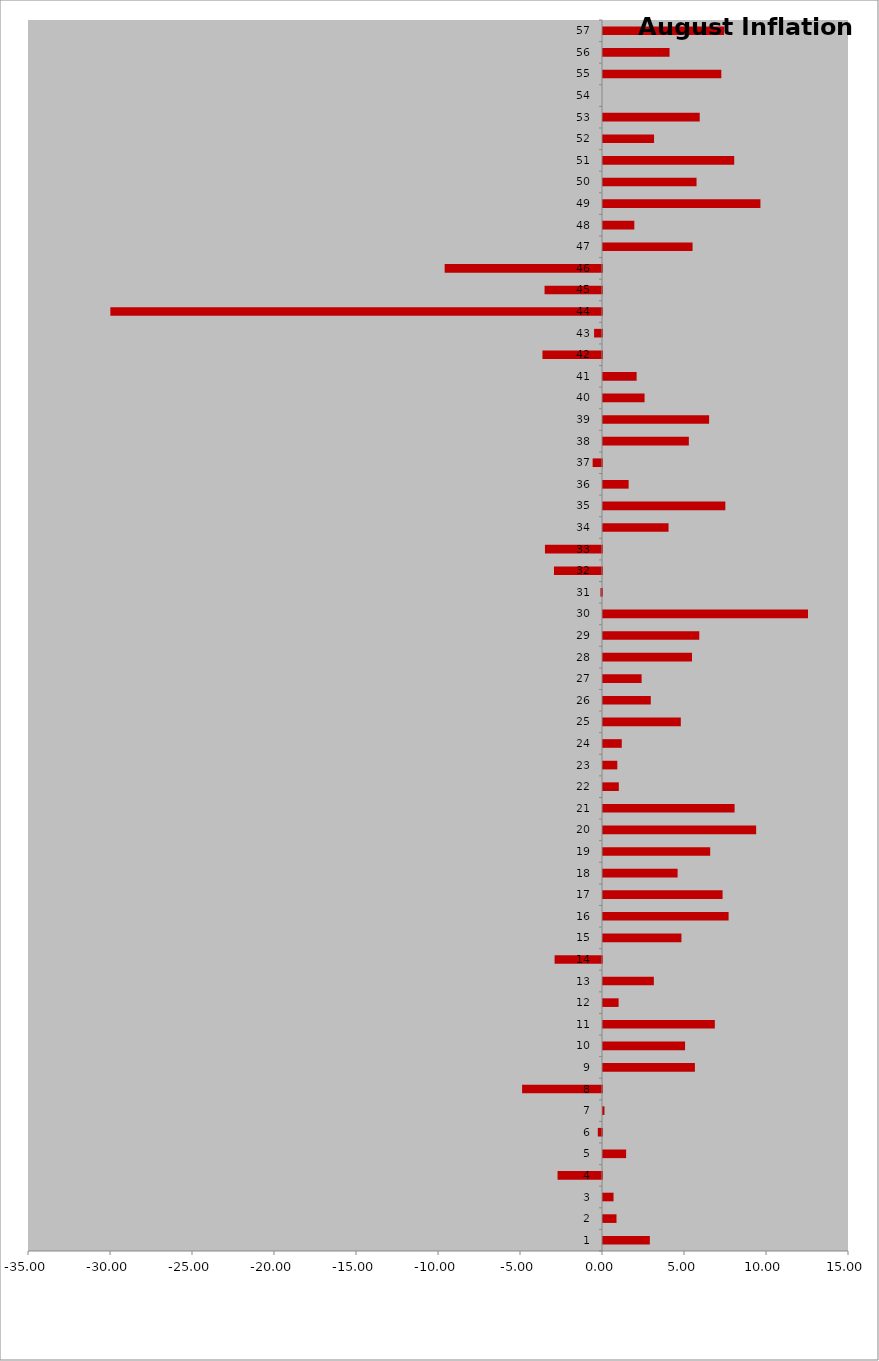
| Category | August Inflation Rate |
|---|---|
| 0 | 2.857 |
| 1 | 0.823 |
| 2 | 0.643 |
| 3 | -2.71 |
| 4 | 1.41 |
| 5 | -0.256 |
| 6 | 0.089 |
| 7 | -4.873 |
| 8 | 5.604 |
| 9 | 5.004 |
| 10 | 6.82 |
| 11 | 0.951 |
| 12 | 3.101 |
| 13 | -2.891 |
| 14 | 4.783 |
| 15 | 7.659 |
| 16 | 7.291 |
| 17 | 4.55 |
| 18 | 6.535 |
| 19 | 9.338 |
| 20 | 8.023 |
| 21 | 0.964 |
| 22 | 0.872 |
| 23 | 1.144 |
| 24 | 4.745 |
| 25 | 2.914 |
| 26 | 2.354 |
| 27 | 5.426 |
| 28 | 5.871 |
| 29 | 12.5 |
| 30 | -0.094 |
| 31 | -2.929 |
| 32 | -3.479 |
| 33 | 3.996 |
| 34 | 7.46 |
| 35 | 1.562 |
| 36 | -0.571 |
| 37 | 5.235 |
| 38 | 6.471 |
| 39 | 2.534 |
| 40 | 2.05 |
| 41 | -3.631 |
| 42 | -0.483 |
| 43 | -29.978 |
| 44 | -3.503 |
| 45 | -9.595 |
| 46 | 5.462 |
| 47 | 1.909 |
| 48 | 9.599 |
| 49 | 5.704 |
| 50 | 8 |
| 51 | 3.114 |
| 52 | 5.898 |
| 53 | 0 |
| 54 | 7.214 |
| 55 | 4.059 |
| 56 | 7.388 |